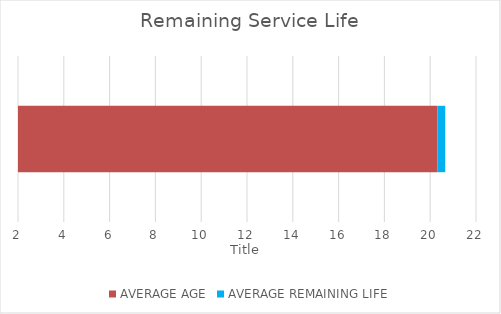
| Category | AVERAGE AGE | AVERAGE REMAINING LIFE |
|---|---|---|
| Heavy Mobile Equipment | 20.314 | 0.343 |